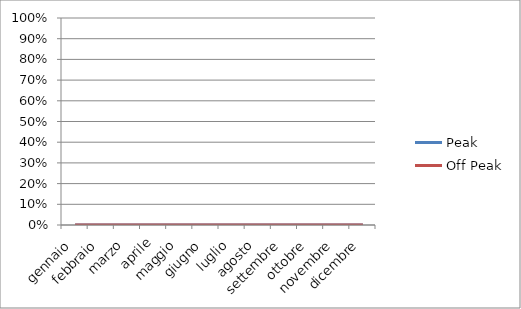
| Category | Peak | Off Peak |
|---|---|---|
| gennaio | 0 | 0 |
| febbraio | 0 | 0 |
| marzo | 0 | 0 |
| aprile | 0 | 0 |
| maggio | 0 | 0 |
| giugno | 0 | 0 |
| luglio | 0 | 0 |
| agosto | 0 | 0 |
| settembre | 0 | 0 |
| ottobre | 0 | 0 |
| novembre | 0 | 0 |
| dicembre | 0 | 0 |